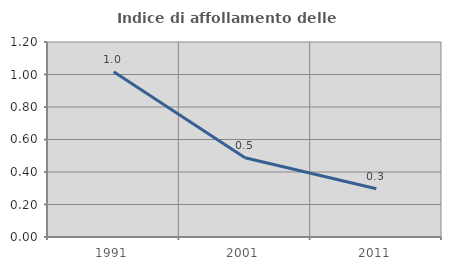
| Category | Indice di affollamento delle abitazioni  |
|---|---|
| 1991.0 | 1.016 |
| 2001.0 | 0.488 |
| 2011.0 | 0.297 |